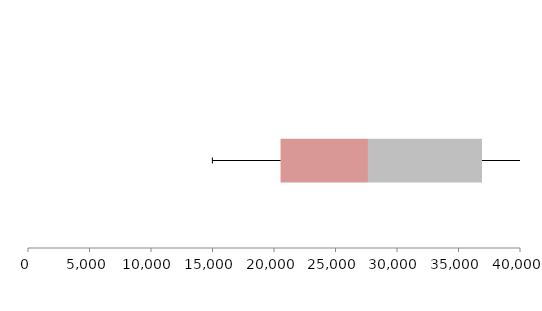
| Category | Series 1 | Series 2 | Series 3 |
|---|---|---|---|
| 0 | 20531.72 | 7107.143 | 9270.286 |